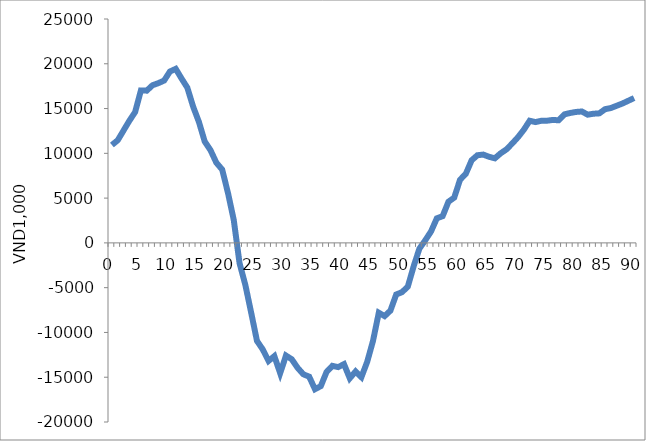
| Category | Series 0 |
|---|---|
| 0.0 | 10929.642 |
| 1.0 | 11459.111 |
| 2.0 | 12539.925 |
| 3.0 | 13628.098 |
| 4.0 | 14605.066 |
| 5.0 | 17023.119 |
| 6.0 | 16999.341 |
| 7.0 | 17601.003 |
| 8.0 | 17836.121 |
| 9.0 | 18125.907 |
| 10.0 | 19134.593 |
| 11.0 | 19432.171 |
| 12.0 | 18357.755 |
| 13.0 | 17331.372 |
| 14.0 | 15215.286 |
| 15.0 | 13501.541 |
| 16.0 | 11313.888 |
| 17.0 | 10343.35 |
| 18.0 | 8954.466 |
| 19.0 | 8192.798 |
| 20.0 | 5595.523 |
| 21.0 | 2567.943 |
| 22.0 | -2263.928 |
| 23.0 | -4700.031 |
| 24.0 | -7779.368 |
| 25.0 | -10939.587 |
| 26.0 | -11898.904 |
| 27.0 | -13182.168 |
| 28.0 | -12647.515 |
| 29.0 | -14545.477 |
| 30.0 | -12583.191 |
| 31.0 | -12996.279 |
| 32.0 | -13946.547 |
| 33.0 | -14672.425 |
| 34.0 | -14938.323 |
| 35.0 | -16337.261 |
| 36.0 | -15995.666 |
| 37.0 | -14408.722 |
| 38.0 | -13730.921 |
| 39.0 | -13870.486 |
| 40.0 | -13540.49 |
| 41.0 | -15116.944 |
| 42.0 | -14356.264 |
| 43.0 | -14993.526 |
| 44.0 | -13275.357 |
| 45.0 | -10944.891 |
| 46.0 | -7798.472 |
| 47.0 | -8175.168 |
| 48.0 | -7566.936 |
| 49.0 | -5764.013 |
| 50.0 | -5499.537 |
| 51.0 | -4883.847 |
| 52.0 | -2627.715 |
| 53.0 | -636.672 |
| 54.0 | 282.341 |
| 55.0 | 1272.494 |
| 56.0 | 2741.476 |
| 57.0 | 2983.94 |
| 58.0 | 4591.631 |
| 59.0 | 5056.822 |
| 60.0 | 7045.907 |
| 61.0 | 7718.623 |
| 62.0 | 9223.921 |
| 63.0 | 9788.367 |
| 64.0 | 9860.819 |
| 65.0 | 9613.934 |
| 66.0 | 9444.303 |
| 67.0 | 9999.627 |
| 68.0 | 10443.215 |
| 69.0 | 11100.614 |
| 70.0 | 11810.015 |
| 71.0 | 12638.99 |
| 72.0 | 13639.072 |
| 73.0 | 13490.376 |
| 74.0 | 13634.314 |
| 75.0 | 13644.489 |
| 76.0 | 13729.616 |
| 77.0 | 13691.958 |
| 78.0 | 14355.21 |
| 79.0 | 14507.699 |
| 80.0 | 14621.755 |
| 81.0 | 14672.419 |
| 82.0 | 14317.55 |
| 83.0 | 14423.715 |
| 84.0 | 14461.966 |
| 85.0 | 14930.575 |
| 86.0 | 15059.186 |
| 87.0 | 15314.131 |
| 88.0 | 15565.361 |
| 89.0 | 15868.912 |
| 90.0 | 16172.462 |